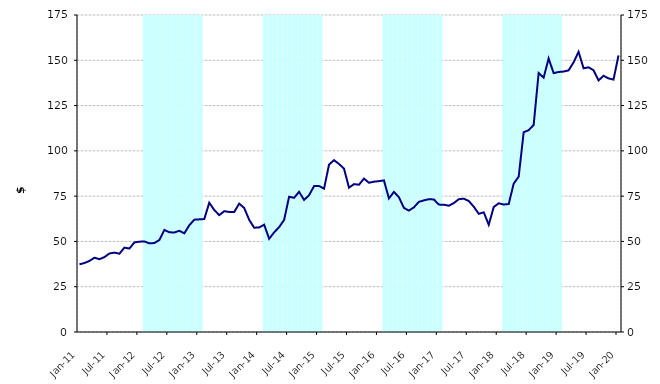
| Category | Series 1 |
|---|---|
| 0 | 0 |
| 1900-01-01 | 0 |
| 1900-01-02 | 0 |
| 1900-01-03 | 0 |
| 1900-01-04 | 0 |
| 1900-01-05 | 0 |
| 1900-01-06 | 0 |
| 1900-01-07 | 0 |
| 1900-01-08 | 0 |
| 1900-01-09 | 0 |
| 1900-01-10 | 0 |
| 1900-01-11 | 0 |
| 1900-01-12 | 0 |
| 1900-01-13 | 175000000 |
| 1900-01-14 | 175000000 |
| 1900-01-15 | 175000000 |
| 1900-01-16 | 175000000 |
| 1900-01-17 | 175000000 |
| 1900-01-18 | 175000000 |
| 1900-01-19 | 175000000 |
| 1900-01-20 | 175000000 |
| 1900-01-21 | 175000000 |
| 1900-01-22 | 175000000 |
| 1900-01-23 | 175000000 |
| 1900-01-24 | 175000000 |
| 1900-01-25 | 0 |
| 1900-01-26 | 0 |
| 1900-01-27 | 0 |
| 1900-01-28 | 0 |
| 1900-01-29 | 0 |
| 1900-01-30 | 0 |
| 1900-01-31 | 0 |
| 1900-02-01 | 0 |
| 1900-02-02 | 0 |
| 1900-02-03 | 0 |
| 1900-02-04 | 0 |
| 1900-02-05 | 0 |
| 1900-02-06 | 175000000 |
| 1900-02-07 | 175000000 |
| 1900-02-08 | 175000000 |
| 1900-02-09 | 175000000 |
| 1900-02-10 | 175000000 |
| 1900-02-11 | 175000000 |
| 1900-02-12 | 175000000 |
| 1900-02-13 | 175000000 |
| 1900-02-14 | 175000000 |
| 1900-02-15 | 175000000 |
| 1900-02-16 | 175000000 |
| 1900-02-17 | 175000000 |
| 1900-02-18 | 0 |
| 1900-02-19 | 0 |
| 1900-02-20 | 0 |
| 1900-02-21 | 0 |
| 1900-02-22 | 0 |
| 1900-02-23 | 0 |
| 1900-02-24 | 0 |
| 1900-02-25 | 0 |
| 1900-02-26 | 0 |
| 1900-02-27 | 0 |
| 1900-02-28 | 0 |
| 1900-02-28 | 0 |
| 1900-03-01 | 175000000 |
| 1900-03-02 | 175000000 |
| 1900-03-03 | 175000000 |
| 1900-03-04 | 175000000 |
| 1900-03-05 | 175000000 |
| 1900-03-06 | 175000000 |
| 1900-03-07 | 175000000 |
| 1900-03-08 | 175000000 |
| 1900-03-09 | 175000000 |
| 1900-03-10 | 175000000 |
| 1900-03-11 | 175000000 |
| 1900-03-12 | 175000000 |
| 1900-03-13 | 0 |
| 1900-03-14 | 0 |
| 1900-03-15 | 0 |
| 1900-03-16 | 0 |
| 1900-03-17 | 0 |
| 1900-03-18 | 0 |
| 1900-03-19 | 0 |
| 1900-03-20 | 0 |
| 1900-03-21 | 0 |
| 1900-03-22 | 0 |
| 1900-03-23 | 0 |
| 1900-03-24 | 0 |
| 1900-03-25 | 175000000 |
| 1900-03-26 | 175000000 |
| 1900-03-27 | 175000000 |
| 1900-03-28 | 175000000 |
| 1900-03-29 | 175000000 |
| 1900-03-30 | 175000000 |
| 1900-03-31 | 175000000 |
| 1900-04-01 | 175000000 |
| 1900-04-02 | 175000000 |
| 1900-04-03 | 175000000 |
| 1900-04-04 | 175000000 |
| 1900-04-05 | 175000000 |
| 1900-04-06 | 0 |
| 1900-04-07 | 0 |
| 1900-04-08 | 0 |
| 1900-04-09 | 0 |
| 1900-04-10 | 0 |
| 1900-04-11 | 0 |
| 1900-04-12 | 0 |
| 1900-04-13 | 0 |
| 1900-04-14 | 0 |
| 1900-04-15 | 0 |
| 1900-04-16 | 0 |
| 1900-04-17 | 0 |